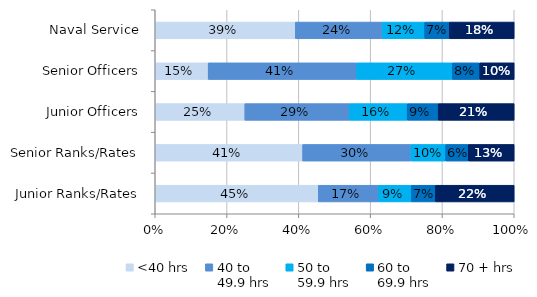
| Category | <40 hrs | 40 to 
49.9 hrs | 50 to 
59.9 hrs | 60 to 
69.9 hrs | 70 + hrs |
|---|---|---|---|---|---|
| Naval Service | 0.39 | 0.242 | 0.119 | 0.069 | 0.181 |
| Senior Officers | 0.147 | 0.414 | 0.266 | 0.077 | 0.096 |
| Junior Officers | 0.25 | 0.291 | 0.161 | 0.087 | 0.212 |
| Senior Ranks/Rates | 0.411 | 0.302 | 0.097 | 0.063 | 0.128 |
| Junior Ranks/Rates | 0.454 | 0.168 | 0.091 | 0.067 | 0.22 |